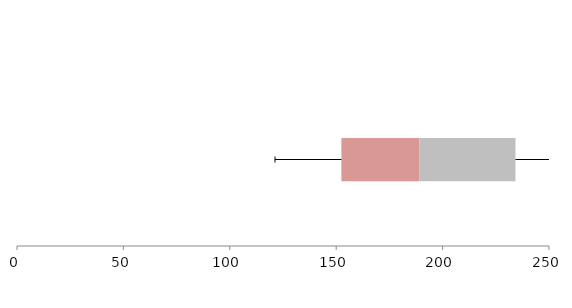
| Category | Series 1 | Series 2 | Series 3 |
|---|---|---|---|
| 0 | 152.441 | 36.601 | 45.208 |